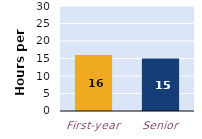
| Category | hours per week |
|---|---|
| First-year | 16 |
| Senior | 15 |